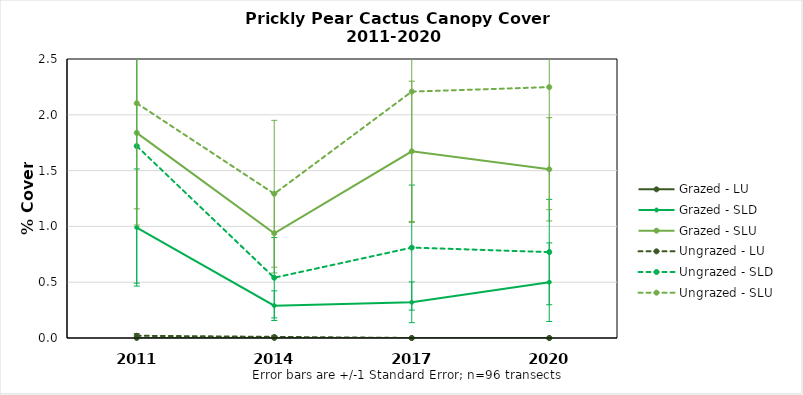
| Category | Grazed - LU | Grazed - SLD | Grazed - SLU | Ungrazed - LU | Ungrazed - SLD | Ungrazed - SLU |
|---|---|---|---|---|---|---|
| 2011.0 | 0 | 0.99 | 1.838 | 0.02 | 1.72 | 2.104 |
| 2014.0 | 0 | 0.29 | 0.938 | 0.01 | 0.54 | 1.292 |
| 2017.0 | 0 | 0.32 | 1.673 | 0 | 0.81 | 2.208 |
| 2020.0 | 0 | 0.5 | 1.512 | 0 | 0.77 | 2.248 |